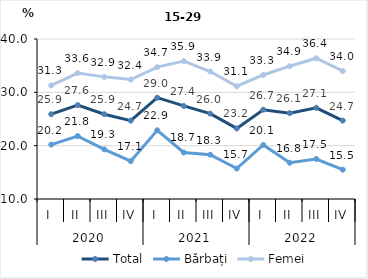
| Category | Total | Bărbați | Femei |
|---|---|---|---|
| 0 | 25.9 | 20.2 | 31.3 |
| 1 | 27.6 | 21.8 | 33.6 |
| 2 | 25.9 | 19.3 | 32.9 |
| 3 | 24.7 | 17.1 | 32.4 |
| 4 | 28.999 | 22.886 | 34.731 |
| 5 | 27.448 | 18.722 | 35.856 |
| 6 | 26 | 18.3 | 33.9 |
| 7 | 23.232 | 15.71 | 31.142 |
| 8 | 26.744 | 20.142 | 33.259 |
| 9 | 26.1 | 16.8 | 34.9 |
| 10 | 27.1 | 17.5 | 36.4 |
| 11 | 24.7 | 15.5 | 34 |